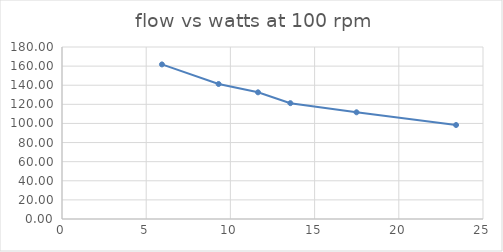
| Category | flow |
|---|---|
| 5.9350000000000005 | 161.769 |
| 9.3 | 141.276 |
| 11.64 | 132.567 |
| 13.56 | 121.237 |
| 17.49 | 111.669 |
| 23.4 | 98.361 |